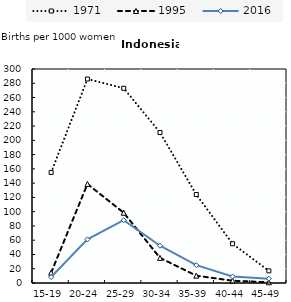
| Category | 1971 | 1995 | 2016 |
|---|---|---|---|
| 15-19 | 155 | 14.5 | 8.33 |
| 20-24 | 286 | 138.8 | 61.11 |
| 25-29 | 273 | 98.5 | 88.05 |
| 30-34 | 211 | 35.2 | 52.27 |
| 35-39 | 124 | 10.3 | 25.01 |
| 40-44 | 55 | 3.2 | 9.07 |
| 45-49 | 17 | 1 | 6.09 |